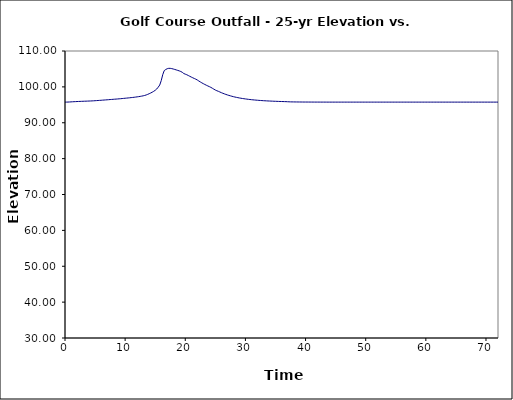
| Category | Series 1 |
|---|---|
| 0.0 | 95.75 |
| 0.25 | 95.754 |
| 0.5 | 95.768 |
| 0.75 | 95.792 |
| 1.0 | 95.818 |
| 1.25 | 95.845 |
| 1.5 | 95.869 |
| 1.75 | 95.891 |
| 2.0 | 95.912 |
| 2.25 | 95.933 |
| 2.5 | 95.951 |
| 2.75 | 95.969 |
| 3.0 | 95.987 |
| 3.25 | 96.003 |
| 3.5 | 96.018 |
| 3.75 | 96.033 |
| 4.0 | 96.05 |
| 4.25 | 96.07 |
| 4.5 | 96.092 |
| 4.75 | 96.117 |
| 5.0 | 96.145 |
| 5.25 | 96.175 |
| 5.5 | 96.204 |
| 5.75 | 96.235 |
| 6.0 | 96.267 |
| 6.25 | 96.299 |
| 6.5 | 96.332 |
| 6.75 | 96.364 |
| 7.0 | 96.398 |
| 7.25 | 96.431 |
| 7.5 | 96.465 |
| 7.75 | 96.497 |
| 8.0 | 96.531 |
| 8.25 | 96.564 |
| 8.5 | 96.598 |
| 8.75 | 96.633 |
| 9.0 | 96.669 |
| 9.25 | 96.705 |
| 9.5 | 96.746 |
| 9.75 | 96.786 |
| 10.0 | 96.829 |
| 10.25 | 96.873 |
| 10.5 | 96.916 |
| 10.75 | 96.959 |
| 11.0 | 97.004 |
| 11.25 | 97.051 |
| 11.5 | 97.103 |
| 11.75 | 97.158 |
| 12.0 | 97.218 |
| 12.25 | 97.282 |
| 12.5 | 97.35 |
| 12.75 | 97.426 |
| 13.0 | 97.508 |
| 13.25 | 97.61 |
| 13.5 | 97.744 |
| 13.75 | 97.91 |
| 14.0 | 98.096 |
| 14.25 | 98.296 |
| 14.5 | 98.513 |
| 14.75 | 98.761 |
| 15.0 | 99.048 |
| 15.25 | 99.4 |
| 15.5 | 99.921 |
| 15.75 | 100.51 |
| 16.0 | 101.736 |
| 16.25 | 103.387 |
| 16.5 | 104.533 |
| 16.75 | 104.842 |
| 17.0 | 105.065 |
| 17.25 | 105.169 |
| 17.5 | 105.164 |
| 17.75 | 105.09 |
| 18.0 | 104.981 |
| 18.25 | 104.858 |
| 18.5 | 104.727 |
| 18.75 | 104.593 |
| 19.0 | 104.459 |
| 19.25 | 104.283 |
| 19.5 | 104.068 |
| 19.75 | 103.723 |
| 20.0 | 103.549 |
| 20.25 | 103.38 |
| 20.5 | 103.17 |
| 20.75 | 102.949 |
| 21.0 | 102.733 |
| 21.25 | 102.531 |
| 21.5 | 102.337 |
| 21.75 | 102.145 |
| 22.0 | 101.918 |
| 22.25 | 101.641 |
| 22.5 | 101.376 |
| 22.75 | 101.128 |
| 23.0 | 100.893 |
| 23.25 | 100.671 |
| 23.5 | 100.459 |
| 23.75 | 100.259 |
| 24.0 | 100.069 |
| 24.25 | 99.864 |
| 24.5 | 99.621 |
| 24.75 | 99.362 |
| 25.0 | 99.118 |
| 25.25 | 98.923 |
| 25.5 | 98.766 |
| 25.75 | 98.575 |
| 26.0 | 98.386 |
| 26.25 | 98.212 |
| 26.5 | 98.05 |
| 26.75 | 97.899 |
| 27.0 | 97.757 |
| 27.25 | 97.625 |
| 27.5 | 97.501 |
| 27.75 | 97.385 |
| 28.0 | 97.272 |
| 28.25 | 97.172 |
| 28.5 | 97.079 |
| 28.75 | 96.993 |
| 29.0 | 96.912 |
| 29.25 | 96.836 |
| 29.5 | 96.767 |
| 29.75 | 96.701 |
| 30.0 | 96.64 |
| 30.25 | 96.582 |
| 30.5 | 96.528 |
| 30.75 | 96.479 |
| 31.0 | 96.431 |
| 31.25 | 96.387 |
| 31.5 | 96.346 |
| 31.75 | 96.309 |
| 32.0 | 96.272 |
| 32.25 | 96.239 |
| 32.5 | 96.207 |
| 32.75 | 96.177 |
| 33.0 | 96.149 |
| 33.25 | 96.123 |
| 33.5 | 96.099 |
| 33.75 | 96.075 |
| 34.0 | 96.054 |
| 34.25 | 96.033 |
| 34.5 | 96.015 |
| 34.75 | 95.997 |
| 35.0 | 95.98 |
| 35.25 | 95.964 |
| 35.5 | 95.948 |
| 35.75 | 95.934 |
| 36.0 | 95.92 |
| 36.25 | 95.908 |
| 36.5 | 95.894 |
| 36.75 | 95.88 |
| 37.0 | 95.86 |
| 37.25 | 95.838 |
| 37.5 | 95.821 |
| 37.75 | 95.813 |
| 38.0 | 95.806 |
| 38.25 | 95.8 |
| 38.5 | 95.795 |
| 38.75 | 95.79 |
| 39.0 | 95.786 |
| 39.25 | 95.782 |
| 39.5 | 95.779 |
| 39.75 | 95.775 |
| 40.0 | 95.772 |
| 40.25 | 95.771 |
| 40.5 | 95.768 |
| 40.75 | 95.767 |
| 41.0 | 95.765 |
| 41.25 | 95.763 |
| 41.5 | 95.761 |
| 41.75 | 95.76 |
| 42.0 | 95.758 |
| 42.25 | 95.758 |
| 42.5 | 95.757 |
| 42.75 | 95.756 |
| 43.0 | 95.756 |
| 43.25 | 95.754 |
| 43.5 | 95.753 |
| 43.75 | 95.753 |
| 44.0 | 95.753 |
| 44.25 | 95.751 |
| 44.5 | 95.751 |
| 44.75 | 95.75 |
| 45.0 | 95.75 |
| 45.25 | 95.75 |
| 45.5 | 95.75 |
| 45.75 | 95.75 |
| 46.0 | 95.75 |
| 46.25 | 95.75 |
| 46.5 | 95.75 |
| 46.75 | 95.75 |
| 47.0 | 95.75 |
| 47.25 | 95.75 |
| 47.5 | 95.75 |
| 47.75 | 95.75 |
| 48.0 | 95.75 |
| 48.25 | 95.75 |
| 48.5 | 95.75 |
| 48.75 | 95.75 |
| 49.0 | 95.75 |
| 49.25 | 95.75 |
| 49.5 | 95.75 |
| 49.75 | 95.75 |
| 50.0 | 95.75 |
| 50.25 | 95.75 |
| 50.5 | 95.75 |
| 50.75 | 95.75 |
| 51.0 | 95.75 |
| 51.25 | 95.75 |
| 51.5 | 95.75 |
| 51.75 | 95.75 |
| 52.0 | 95.75 |
| 52.25 | 95.75 |
| 52.5 | 95.75 |
| 52.75 | 95.75 |
| 53.0 | 95.75 |
| 53.25 | 95.75 |
| 53.5 | 95.75 |
| 53.75 | 95.75 |
| 54.0 | 95.75 |
| 54.25 | 95.75 |
| 54.5 | 95.75 |
| 54.75 | 95.75 |
| 55.0 | 95.75 |
| 55.25 | 95.75 |
| 55.5 | 95.75 |
| 55.75 | 95.75 |
| 56.0 | 95.75 |
| 56.25 | 95.75 |
| 56.5 | 95.75 |
| 56.75 | 95.75 |
| 57.0 | 95.75 |
| 57.25 | 95.75 |
| 57.5 | 95.75 |
| 57.75 | 95.75 |
| 58.0 | 95.75 |
| 58.25 | 95.75 |
| 58.5 | 95.75 |
| 58.75 | 95.75 |
| 59.0 | 95.75 |
| 59.25 | 95.75 |
| 59.5 | 95.75 |
| 59.75 | 95.75 |
| 60.0 | 95.75 |
| 60.25 | 95.75 |
| 60.5 | 95.75 |
| 60.75 | 95.75 |
| 61.0 | 95.75 |
| 61.25 | 95.75 |
| 61.5 | 95.75 |
| 61.75 | 95.75 |
| 62.0 | 95.75 |
| 62.25 | 95.75 |
| 62.5 | 95.75 |
| 62.75 | 95.75 |
| 63.0 | 95.75 |
| 63.25 | 95.75 |
| 63.5 | 95.75 |
| 63.75 | 95.75 |
| 64.0 | 95.75 |
| 64.25 | 95.75 |
| 64.5 | 95.75 |
| 64.75 | 95.75 |
| 65.0 | 95.75 |
| 65.25 | 95.75 |
| 65.5 | 95.75 |
| 65.75 | 95.75 |
| 66.0 | 95.75 |
| 66.25 | 95.75 |
| 66.5 | 95.75 |
| 66.75 | 95.75 |
| 67.0 | 95.75 |
| 67.25 | 95.75 |
| 67.5 | 95.75 |
| 67.75 | 95.75 |
| 68.0 | 95.75 |
| 68.25 | 95.75 |
| 68.5 | 95.75 |
| 68.75 | 95.75 |
| 69.0 | 95.75 |
| 69.25 | 95.75 |
| 69.5 | 95.75 |
| 69.75 | 95.75 |
| 70.0 | 95.75 |
| 70.25 | 95.75 |
| 70.5 | 95.75 |
| 70.75 | 95.75 |
| 71.0 | 95.75 |
| 71.25 | 95.75 |
| 71.5 | 95.75 |
| 71.75 | 95.75 |
| 72.0 | 95.75 |
| 72.25 | 95.75 |
| 72.5 | 95.75 |
| 72.75 | 95.75 |
| 73.0 | 95.75 |
| 73.25 | 95.75 |
| 73.5 | 95.75 |
| 73.75 | 95.75 |
| 74.0 | 95.75 |
| 74.25 | 95.75 |
| 74.5 | 95.75 |
| 74.75 | 95.75 |
| 75.0 | 95.75 |
| 75.25 | 95.75 |
| 75.5 | 95.75 |
| 75.75 | 95.75 |
| 76.0 | 95.75 |
| 76.25 | 95.75 |
| 76.5 | 95.75 |
| 76.75 | 95.75 |
| 77.0 | 95.75 |
| 77.25 | 95.75 |
| 77.5 | 95.75 |
| 77.75 | 95.75 |
| 78.0 | 95.75 |
| 78.25 | 95.75 |
| 78.5 | 95.75 |
| 78.75 | 95.75 |
| 79.0 | 95.75 |
| 79.25 | 95.75 |
| 79.5 | 95.75 |
| 79.75 | 95.75 |
| 80.0 | 95.75 |
| 80.25 | 95.75 |
| 80.5 | 95.75 |
| 80.75 | 95.75 |
| 81.0 | 95.75 |
| 81.25 | 95.75 |
| 81.5 | 95.75 |
| 81.75 | 95.75 |
| 82.0 | 95.75 |
| 82.25 | 95.75 |
| 82.5 | 95.75 |
| 82.75 | 95.75 |
| 83.0 | 95.75 |
| 83.25 | 95.75 |
| 83.5 | 95.75 |
| 83.75 | 95.75 |
| 84.0 | 95.75 |
| 84.25 | 95.75 |
| 84.5 | 95.75 |
| 84.75 | 95.75 |
| 85.0 | 95.75 |
| 85.25 | 95.75 |
| 85.5 | 95.75 |
| 85.75 | 95.75 |
| 86.0 | 95.75 |
| 86.25 | 95.75 |
| 86.5 | 95.75 |
| 86.75 | 95.75 |
| 87.0 | 95.75 |
| 87.25 | 95.75 |
| 87.5 | 95.75 |
| 87.75 | 95.75 |
| 88.0 | 95.75 |
| 88.25 | 95.75 |
| 88.5 | 95.75 |
| 88.75 | 95.75 |
| 89.0 | 95.75 |
| 89.25 | 95.75 |
| 89.5 | 95.75 |
| 89.75 | 95.75 |
| 90.0 | 95.75 |
| 90.25 | 95.75 |
| 90.5 | 95.75 |
| 90.75 | 95.75 |
| 91.0 | 95.75 |
| 91.25 | 95.75 |
| 91.5 | 95.75 |
| 91.75 | 95.75 |
| 92.0 | 95.75 |
| 92.25 | 95.75 |
| 92.5 | 95.75 |
| 92.75 | 95.75 |
| 93.0 | 95.75 |
| 93.25 | 95.75 |
| 93.5 | 95.75 |
| 93.75 | 95.75 |
| 94.0 | 95.75 |
| 94.25 | 95.75 |
| 94.5 | 95.75 |
| 94.75 | 95.75 |
| 95.0 | 95.75 |
| 95.25 | 95.75 |
| 95.5 | 95.75 |
| 95.75 | 95.75 |
| 96.0 | 95.75 |
| 96.25 | 95.75 |
| 96.5 | 95.75 |
| 96.75 | 95.75 |
| 97.0 | 95.75 |
| 97.25 | 95.75 |
| 97.5 | 95.75 |
| 97.75 | 95.75 |
| 98.0 | 95.75 |
| 98.25 | 95.75 |
| 98.5 | 95.75 |
| 98.75 | 95.75 |
| 99.0 | 95.75 |
| 99.25 | 95.75 |
| 99.5 | 95.75 |
| 99.75 | 95.75 |
| 100.0 | 95.75 |
| 100.25 | 95.75 |
| 100.5 | 95.75 |
| 100.75 | 95.75 |
| 101.0 | 95.75 |
| 101.25 | 95.75 |
| 101.5 | 95.75 |
| 101.75 | 95.75 |
| 102.0 | 95.75 |
| 102.25 | 95.75 |
| 102.5 | 95.75 |
| 102.75 | 95.75 |
| 103.0 | 95.75 |
| 103.25 | 95.75 |
| 103.5 | 95.75 |
| 103.75 | 95.75 |
| 104.0 | 95.75 |
| 104.25 | 95.75 |
| 104.5 | 95.75 |
| 104.75 | 95.75 |
| 105.0 | 95.75 |
| 105.25 | 95.75 |
| 105.5 | 95.75 |
| 105.75 | 95.75 |
| 106.0 | 95.75 |
| 106.25 | 95.75 |
| 106.5 | 95.75 |
| 106.75 | 95.75 |
| 107.0 | 95.75 |
| 107.25 | 95.75 |
| 107.5 | 95.75 |
| 107.75 | 95.75 |
| 108.0 | 95.75 |
| 108.25 | 95.75 |
| 108.5 | 95.75 |
| 108.75 | 95.75 |
| 109.0 | 95.75 |
| 109.25 | 95.75 |
| 109.5 | 95.75 |
| 109.75 | 95.75 |
| 110.0 | 95.75 |
| 110.25 | 95.75 |
| 110.5 | 95.75 |
| 110.75 | 95.75 |
| 111.0 | 95.75 |
| 111.25 | 95.75 |
| 111.5 | 95.75 |
| 111.75 | 95.75 |
| 112.0 | 95.75 |
| 112.25 | 95.75 |
| 112.5 | 95.75 |
| 112.75 | 95.75 |
| 113.0 | 95.75 |
| 113.25 | 95.75 |
| 113.5 | 95.75 |
| 113.75 | 95.75 |
| 114.0 | 95.75 |
| 114.25 | 95.75 |
| 114.5 | 95.75 |
| 114.75 | 95.75 |
| 115.0 | 95.75 |
| 115.25 | 95.75 |
| 115.5 | 95.75 |
| 115.75 | 95.75 |
| 116.0 | 95.75 |
| 116.25 | 95.75 |
| 116.5 | 95.75 |
| 116.75 | 95.75 |
| 117.0 | 95.75 |
| 117.25 | 95.75 |
| 117.5 | 95.75 |
| 117.75 | 95.75 |
| 118.0 | 95.75 |
| 118.25 | 95.75 |
| 118.5 | 95.75 |
| 118.75 | 95.75 |
| 119.0 | 95.75 |
| 119.25 | 95.75 |
| 119.5 | 95.75 |
| 119.75 | 95.75 |
| 120.0 | 95.75 |
| 120.25 | 95.75 |
| 120.5 | 95.75 |
| 120.75 | 95.75 |
| 121.0 | 95.75 |
| 121.25 | 95.75 |
| 121.5 | 95.75 |
| 121.75 | 95.75 |
| 122.0 | 95.75 |
| 122.25 | 95.75 |
| 122.5 | 95.75 |
| 122.75 | 95.75 |
| 123.0 | 95.75 |
| 123.25 | 95.75 |
| 123.5 | 95.75 |
| 123.75 | 95.75 |
| 124.0 | 95.75 |
| 124.25 | 95.75 |
| 124.5 | 95.75 |
| 124.75 | 95.75 |
| 125.0 | 95.75 |
| 125.25 | 95.75 |
| 125.5 | 95.75 |
| 125.75 | 95.75 |
| 126.0 | 95.75 |
| 126.25 | 95.75 |
| 126.5 | 95.75 |
| 126.75 | 95.75 |
| 127.0 | 95.75 |
| 127.25 | 95.75 |
| 127.5 | 95.75 |
| 127.75 | 95.75 |
| 128.0 | 95.75 |
| 128.25 | 95.75 |
| 128.5 | 95.75 |
| 128.75 | 95.75 |
| 129.0 | 95.75 |
| 129.25 | 95.75 |
| 129.5 | 95.75 |
| 129.75 | 95.75 |
| 130.0 | 95.75 |
| 130.25 | 95.75 |
| 130.5 | 95.75 |
| 130.75 | 95.75 |
| 131.0 | 95.75 |
| 131.25 | 95.75 |
| 131.5 | 95.75 |
| 131.75 | 95.75 |
| 132.0 | 95.75 |
| 132.25 | 95.75 |
| 132.5 | 95.75 |
| 132.75 | 95.75 |
| 133.0 | 95.75 |
| 133.25 | 95.75 |
| 133.5 | 95.75 |
| 133.75 | 95.75 |
| 134.0 | 95.75 |
| 134.25 | 95.75 |
| 134.5 | 95.75 |
| 134.75 | 95.75 |
| 135.0 | 95.75 |
| 135.25 | 95.75 |
| 135.5 | 95.75 |
| 135.75 | 95.75 |
| 136.0 | 95.75 |
| 136.25 | 95.75 |
| 136.5 | 95.75 |
| 136.75 | 95.75 |
| 137.0 | 95.75 |
| 137.25 | 95.75 |
| 137.5 | 95.75 |
| 137.75 | 95.75 |
| 138.0 | 95.75 |
| 138.25 | 95.75 |
| 138.5 | 95.75 |
| 138.75 | 95.75 |
| 139.0 | 95.75 |
| 139.25 | 95.75 |
| 139.5 | 95.75 |
| 139.75 | 95.75 |
| 140.0 | 95.75 |
| 140.25 | 95.75 |
| 140.5 | 95.75 |
| 140.75 | 95.75 |
| 141.0 | 95.75 |
| 141.25 | 95.75 |
| 141.5 | 95.75 |
| 141.75 | 95.75 |
| 142.0 | 95.75 |
| 142.25 | 95.75 |
| 142.5 | 95.75 |
| 142.75 | 95.75 |
| 143.0 | 95.75 |
| 143.25 | 95.75 |
| 143.5 | 95.75 |
| 143.75 | 95.75 |
| 144.0 | 95.75 |
| 144.25 | 95.75 |
| 144.5 | 95.75 |
| 144.75 | 95.75 |
| 145.0 | 95.75 |
| 145.25 | 95.75 |
| 145.5 | 95.75 |
| 145.75 | 95.75 |
| 146.0 | 95.75 |
| 146.25 | 95.75 |
| 146.5 | 95.75 |
| 146.75 | 95.75 |
| 147.0 | 95.75 |
| 147.25 | 95.75 |
| 147.5 | 95.75 |
| 147.75 | 95.75 |
| 148.0 | 95.75 |
| 148.25 | 95.75 |
| 148.5 | 95.75 |
| 148.75 | 95.75 |
| 149.0 | 95.75 |
| 149.25 | 95.75 |
| 149.5 | 95.75 |
| 149.75 | 95.75 |
| 150.0 | 95.75 |
| 150.25 | 95.75 |
| 150.5 | 95.75 |
| 150.75 | 95.75 |
| 151.0 | 95.75 |
| 151.25 | 95.75 |
| 151.5 | 95.75 |
| 151.75 | 95.75 |
| 152.0 | 95.75 |
| 152.25 | 95.75 |
| 152.5 | 95.75 |
| 152.75 | 95.75 |
| 153.0 | 95.75 |
| 153.25 | 95.75 |
| 153.5 | 95.75 |
| 153.75 | 95.75 |
| 154.0 | 95.75 |
| 154.25 | 95.75 |
| 154.5 | 95.75 |
| 154.75 | 95.75 |
| 155.0 | 95.75 |
| 155.25 | 95.75 |
| 155.5 | 95.75 |
| 155.75 | 95.75 |
| 156.0 | 95.75 |
| 156.25 | 95.75 |
| 156.5 | 95.75 |
| 156.75 | 95.75 |
| 157.0 | 95.75 |
| 157.25 | 95.75 |
| 157.5 | 95.75 |
| 157.75 | 95.75 |
| 158.0 | 95.75 |
| 158.25 | 95.75 |
| 158.5 | 95.75 |
| 158.75 | 95.75 |
| 159.0 | 95.75 |
| 159.25 | 95.75 |
| 159.5 | 95.75 |
| 159.75 | 95.75 |
| 160.0 | 95.75 |
| 160.25 | 95.75 |
| 160.5 | 95.75 |
| 160.75 | 95.75 |
| 161.0 | 95.75 |
| 161.25 | 95.75 |
| 161.5 | 95.75 |
| 161.75 | 95.75 |
| 162.0 | 95.75 |
| 162.25 | 95.75 |
| 162.5 | 95.75 |
| 162.75 | 95.75 |
| 163.0 | 95.75 |
| 163.25 | 95.75 |
| 163.5 | 95.75 |
| 163.75 | 95.75 |
| 164.0 | 95.75 |
| 164.25 | 95.75 |
| 164.5 | 95.75 |
| 164.75 | 95.75 |
| 165.0 | 95.75 |
| 165.25 | 95.75 |
| 165.5 | 95.75 |
| 165.75 | 95.75 |
| 166.0 | 95.75 |
| 166.25 | 95.75 |
| 166.5 | 95.75 |
| 166.75 | 95.75 |
| 167.0 | 95.75 |
| 167.25 | 95.75 |
| 167.5 | 95.75 |
| 167.75 | 95.75 |
| 168.0 | 95.75 |
| 168.25 | 95.75 |
| 168.5 | 95.75 |
| 168.75 | 95.75 |
| 169.0 | 95.75 |
| 169.25 | 95.75 |
| 169.5 | 95.75 |
| 169.75 | 95.75 |
| 170.0 | 95.75 |
| 170.25 | 95.75 |
| 170.5 | 95.75 |
| 170.75 | 95.75 |
| 171.0 | 95.75 |
| 171.25 | 95.75 |
| 171.5 | 95.75 |
| 171.75 | 95.75 |
| 172.0 | 95.75 |
| 172.25 | 95.75 |
| 172.5 | 95.75 |
| 172.75 | 95.75 |
| 173.0 | 95.75 |
| 173.25 | 95.75 |
| 173.5 | 95.75 |
| 173.75 | 95.75 |
| 174.0 | 95.75 |
| 174.25 | 95.75 |
| 174.5 | 95.75 |
| 174.75 | 95.75 |
| 175.0 | 95.75 |
| 175.25 | 95.75 |
| 175.5 | 95.75 |
| 175.75 | 95.75 |
| 176.0 | 95.75 |
| 176.25 | 95.75 |
| 176.5 | 95.75 |
| 176.75 | 95.75 |
| 177.0 | 95.75 |
| 177.25 | 95.75 |
| 177.5 | 95.75 |
| 177.75 | 95.75 |
| 178.0 | 95.75 |
| 178.25 | 95.75 |
| 178.5 | 95.75 |
| 178.75 | 95.75 |
| 179.0 | 95.75 |
| 179.25 | 95.75 |
| 179.5 | 95.75 |
| 179.75 | 95.75 |
| 180.0 | 95.75 |
| 180.25 | 95.75 |
| 180.5 | 95.75 |
| 180.75 | 95.75 |
| 181.0 | 95.75 |
| 181.25 | 95.75 |
| 181.5 | 95.75 |
| 181.75 | 95.75 |
| 182.0 | 95.75 |
| 182.25 | 95.75 |
| 182.5 | 95.75 |
| 182.75 | 95.75 |
| 183.0 | 95.75 |
| 183.25 | 95.75 |
| 183.5 | 95.75 |
| 183.75 | 95.75 |
| 184.0 | 95.75 |
| 184.25 | 95.75 |
| 184.5 | 95.75 |
| 184.75 | 95.75 |
| 185.0 | 95.75 |
| 185.25 | 95.75 |
| 185.5 | 95.75 |
| 185.75 | 95.75 |
| 186.0 | 95.75 |
| 186.25 | 95.75 |
| 186.5 | 95.75 |
| 186.75 | 95.75 |
| 187.0 | 95.75 |
| 187.25 | 95.75 |
| 187.5 | 95.75 |
| 187.75 | 95.75 |
| 188.0 | 95.75 |
| 188.25 | 95.75 |
| 188.5 | 95.75 |
| 188.75 | 95.75 |
| 189.0 | 95.75 |
| 189.25 | 95.75 |
| 189.5 | 95.75 |
| 189.75 | 95.75 |
| 190.0 | 95.75 |
| 190.25 | 95.75 |
| 190.5 | 95.75 |
| 190.75 | 95.75 |
| 191.0 | 95.75 |
| 191.25 | 95.75 |
| 191.5 | 95.75 |
| 191.75 | 95.75 |